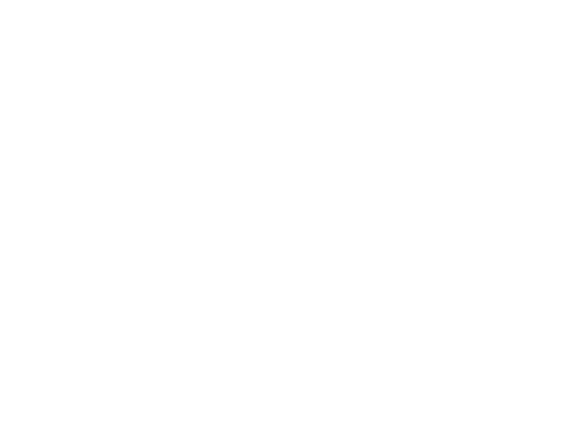
| Category | Series 0 |
|---|---|
| Domestic meters
Non-smart
36.7m | 36649305 |
| Domestic meters
Smart
15.2m | 15195441 |
| Smart, 1.3m | 1290527 |
| Non-smart, 1.9m | 1909595 |